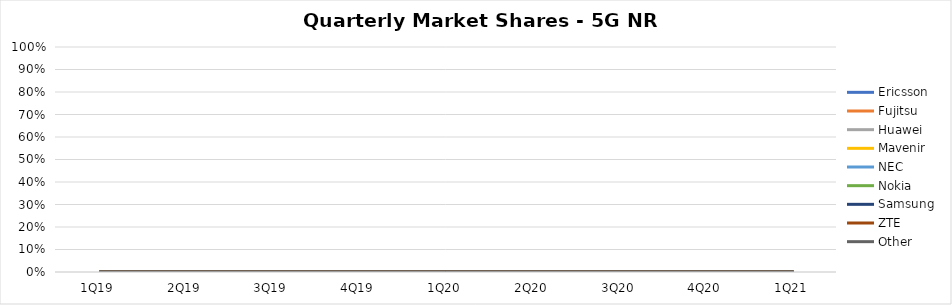
| Category | Ericsson | Fujitsu | Huawei | Mavenir | NEC | Nokia | Samsung | ZTE | Other |
|---|---|---|---|---|---|---|---|---|---|
| 1Q19 | 0 | 0 | 0 | 0 | 0 | 0 | 0 | 0 | 0 |
| 2Q19 | 0 | 0 | 0 | 0 | 0 | 0 | 0 | 0 | 0 |
| 3Q19 | 0 | 0 | 0 | 0 | 0 | 0 | 0 | 0 | 0 |
| 4Q19 | 0 | 0 | 0 | 0 | 0 | 0 | 0 | 0 | 0 |
| 1Q20 | 0 | 0 | 0 | 0 | 0 | 0 | 0 | 0 | 0 |
| 2Q20 | 0 | 0 | 0 | 0 | 0 | 0 | 0 | 0 | 0 |
| 3Q20 | 0 | 0 | 0 | 0 | 0 | 0 | 0 | 0 | 0 |
| 4Q20 | 0 | 0 | 0 | 0 | 0 | 0 | 0 | 0 | 0 |
| 1Q21 | 0 | 0 | 0 | 0 | 0 | 0 | 0 | 0 | 0 |